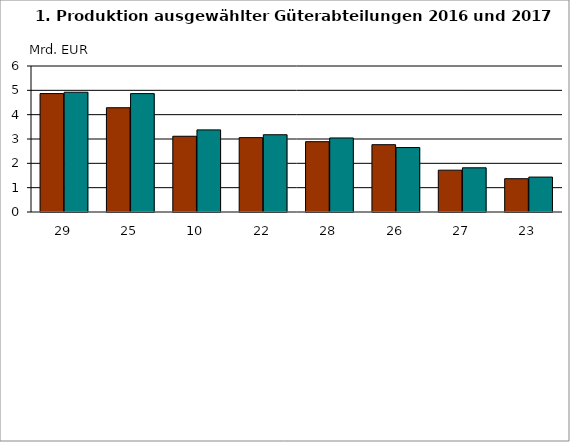
| Category | Series 0 | Series 1 |
|---|---|---|
| 29.0 | 4.867 | 4.922 |
| 25.0 | 4.284 | 4.865 |
| 10.0 | 3.112 | 3.375 |
| 22.0 | 3.056 | 3.175 |
| 28.0 | 2.89 | 3.043 |
| 26.0 | 2.766 | 2.649 |
| 27.0 | 1.719 | 1.816 |
| 23.0 | 1.368 | 1.435 |